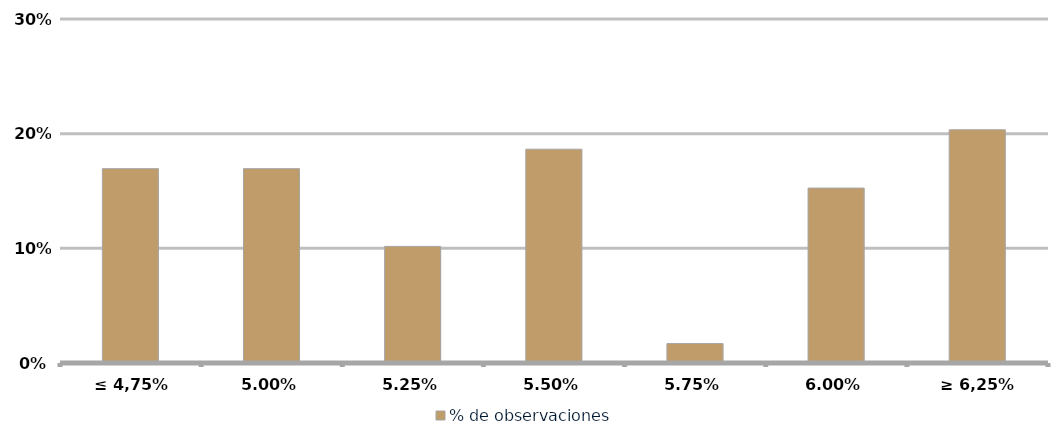
| Category | % de observaciones  |
|---|---|
| ≤ 4,75% | 0.169 |
| 5,00% | 0.169 |
| 5,25% | 0.102 |
| 5,50% | 0.186 |
| 5,75% | 0.017 |
| 6,00% | 0.153 |
| ≥ 6,25% | 0.203 |